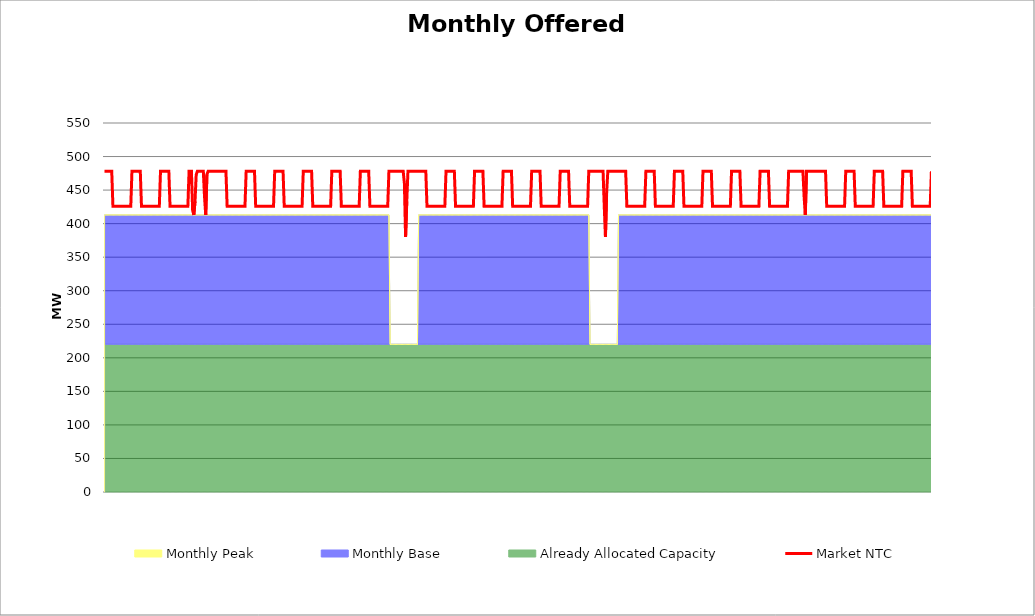
| Category | Market NTC |
|---|---|
| 0 | 478 |
| 1 | 478 |
| 2 | 478 |
| 3 | 478 |
| 4 | 478 |
| 5 | 478 |
| 6 | 478 |
| 7 | 426 |
| 8 | 426 |
| 9 | 426 |
| 10 | 426 |
| 11 | 426 |
| 12 | 426 |
| 13 | 426 |
| 14 | 426 |
| 15 | 426 |
| 16 | 426 |
| 17 | 426 |
| 18 | 426 |
| 19 | 426 |
| 20 | 426 |
| 21 | 426 |
| 22 | 426 |
| 23 | 478 |
| 24 | 478 |
| 25 | 478 |
| 26 | 478 |
| 27 | 478 |
| 28 | 478 |
| 29 | 478 |
| 30 | 478 |
| 31 | 426 |
| 32 | 426 |
| 33 | 426 |
| 34 | 426 |
| 35 | 426 |
| 36 | 426 |
| 37 | 426 |
| 38 | 426 |
| 39 | 426 |
| 40 | 426 |
| 41 | 426 |
| 42 | 426 |
| 43 | 426 |
| 44 | 426 |
| 45 | 426 |
| 46 | 426 |
| 47 | 478 |
| 48 | 478 |
| 49 | 478 |
| 50 | 478 |
| 51 | 478 |
| 52 | 478 |
| 53 | 478 |
| 54 | 478 |
| 55 | 426 |
| 56 | 426 |
| 57 | 426 |
| 58 | 426 |
| 59 | 426 |
| 60 | 426 |
| 61 | 426 |
| 62 | 426 |
| 63 | 426 |
| 64 | 426 |
| 65 | 426 |
| 66 | 426 |
| 67 | 426 |
| 68 | 426 |
| 69 | 426 |
| 70 | 426 |
| 71 | 478 |
| 72 | 478 |
| 73 | 478 |
| 74 | 420 |
| 75 | 413 |
| 76 | 433 |
| 77 | 473 |
| 78 | 478 |
| 79 | 478 |
| 80 | 478 |
| 81 | 478 |
| 82 | 478 |
| 83 | 478 |
| 84 | 440 |
| 85 | 413 |
| 86 | 473 |
| 87 | 478 |
| 88 | 478 |
| 89 | 478 |
| 90 | 478 |
| 91 | 478 |
| 92 | 478 |
| 93 | 478 |
| 94 | 478 |
| 95 | 478 |
| 96 | 478 |
| 97 | 478 |
| 98 | 478 |
| 99 | 478 |
| 100 | 478 |
| 101 | 478 |
| 102 | 478 |
| 103 | 426 |
| 104 | 426 |
| 105 | 426 |
| 106 | 426 |
| 107 | 426 |
| 108 | 426 |
| 109 | 426 |
| 110 | 426 |
| 111 | 426 |
| 112 | 426 |
| 113 | 426 |
| 114 | 426 |
| 115 | 426 |
| 116 | 426 |
| 117 | 426 |
| 118 | 426 |
| 119 | 478 |
| 120 | 478 |
| 121 | 478 |
| 122 | 478 |
| 123 | 478 |
| 124 | 478 |
| 125 | 478 |
| 126 | 478 |
| 127 | 426 |
| 128 | 426 |
| 129 | 426 |
| 130 | 426 |
| 131 | 426 |
| 132 | 426 |
| 133 | 426 |
| 134 | 426 |
| 135 | 426 |
| 136 | 426 |
| 137 | 426 |
| 138 | 426 |
| 139 | 426 |
| 140 | 426 |
| 141 | 426 |
| 142 | 426 |
| 143 | 478 |
| 144 | 478 |
| 145 | 478 |
| 146 | 478 |
| 147 | 478 |
| 148 | 478 |
| 149 | 478 |
| 150 | 478 |
| 151 | 426 |
| 152 | 426 |
| 153 | 426 |
| 154 | 426 |
| 155 | 426 |
| 156 | 426 |
| 157 | 426 |
| 158 | 426 |
| 159 | 426 |
| 160 | 426 |
| 161 | 426 |
| 162 | 426 |
| 163 | 426 |
| 164 | 426 |
| 165 | 426 |
| 166 | 426 |
| 167 | 478 |
| 168 | 478 |
| 169 | 478 |
| 170 | 478 |
| 171 | 478 |
| 172 | 478 |
| 173 | 478 |
| 174 | 478 |
| 175 | 426 |
| 176 | 426 |
| 177 | 426 |
| 178 | 426 |
| 179 | 426 |
| 180 | 426 |
| 181 | 426 |
| 182 | 426 |
| 183 | 426 |
| 184 | 426 |
| 185 | 426 |
| 186 | 426 |
| 187 | 426 |
| 188 | 426 |
| 189 | 426 |
| 190 | 426 |
| 191 | 478 |
| 192 | 478 |
| 193 | 478 |
| 194 | 478 |
| 195 | 478 |
| 196 | 478 |
| 197 | 478 |
| 198 | 478 |
| 199 | 426 |
| 200 | 426 |
| 201 | 426 |
| 202 | 426 |
| 203 | 426 |
| 204 | 426 |
| 205 | 426 |
| 206 | 426 |
| 207 | 426 |
| 208 | 426 |
| 209 | 426 |
| 210 | 426 |
| 211 | 426 |
| 212 | 426 |
| 213 | 426 |
| 214 | 426 |
| 215 | 478 |
| 216 | 478 |
| 217 | 478 |
| 218 | 478 |
| 219 | 478 |
| 220 | 478 |
| 221 | 478 |
| 222 | 478 |
| 223 | 426 |
| 224 | 426 |
| 225 | 426 |
| 226 | 426 |
| 227 | 426 |
| 228 | 426 |
| 229 | 426 |
| 230 | 426 |
| 231 | 426 |
| 232 | 426 |
| 233 | 426 |
| 234 | 426 |
| 235 | 426 |
| 236 | 426 |
| 237 | 426 |
| 238 | 426 |
| 239 | 478 |
| 240 | 478 |
| 241 | 478 |
| 242 | 478 |
| 243 | 478 |
| 244 | 478 |
| 245 | 478 |
| 246 | 478 |
| 247 | 478 |
| 248 | 478 |
| 249 | 478 |
| 250 | 478 |
| 251 | 478 |
| 252 | 460 |
| 253 | 380 |
| 254 | 433 |
| 255 | 478 |
| 256 | 478 |
| 257 | 478 |
| 258 | 478 |
| 259 | 478 |
| 260 | 478 |
| 261 | 478 |
| 262 | 478 |
| 263 | 478 |
| 264 | 478 |
| 265 | 478 |
| 266 | 478 |
| 267 | 478 |
| 268 | 478 |
| 269 | 478 |
| 270 | 478 |
| 271 | 426 |
| 272 | 426 |
| 273 | 426 |
| 274 | 426 |
| 275 | 426 |
| 276 | 426 |
| 277 | 426 |
| 278 | 426 |
| 279 | 426 |
| 280 | 426 |
| 281 | 426 |
| 282 | 426 |
| 283 | 426 |
| 284 | 426 |
| 285 | 426 |
| 286 | 426 |
| 287 | 478 |
| 288 | 478 |
| 289 | 478 |
| 290 | 478 |
| 291 | 478 |
| 292 | 478 |
| 293 | 478 |
| 294 | 478 |
| 295 | 426 |
| 296 | 426 |
| 297 | 426 |
| 298 | 426 |
| 299 | 426 |
| 300 | 426 |
| 301 | 426 |
| 302 | 426 |
| 303 | 426 |
| 304 | 426 |
| 305 | 426 |
| 306 | 426 |
| 307 | 426 |
| 308 | 426 |
| 309 | 426 |
| 310 | 426 |
| 311 | 478 |
| 312 | 478 |
| 313 | 478 |
| 314 | 478 |
| 315 | 478 |
| 316 | 478 |
| 317 | 478 |
| 318 | 478 |
| 319 | 426 |
| 320 | 426 |
| 321 | 426 |
| 322 | 426 |
| 323 | 426 |
| 324 | 426 |
| 325 | 426 |
| 326 | 426 |
| 327 | 426 |
| 328 | 426 |
| 329 | 426 |
| 330 | 426 |
| 331 | 426 |
| 332 | 426 |
| 333 | 426 |
| 334 | 426 |
| 335 | 478 |
| 336 | 478 |
| 337 | 478 |
| 338 | 478 |
| 339 | 478 |
| 340 | 478 |
| 341 | 478 |
| 342 | 478 |
| 343 | 426 |
| 344 | 426 |
| 345 | 426 |
| 346 | 426 |
| 347 | 426 |
| 348 | 426 |
| 349 | 426 |
| 350 | 426 |
| 351 | 426 |
| 352 | 426 |
| 353 | 426 |
| 354 | 426 |
| 355 | 426 |
| 356 | 426 |
| 357 | 426 |
| 358 | 426 |
| 359 | 478 |
| 360 | 478 |
| 361 | 478 |
| 362 | 478 |
| 363 | 478 |
| 364 | 478 |
| 365 | 478 |
| 366 | 478 |
| 367 | 426 |
| 368 | 426 |
| 369 | 426 |
| 370 | 426 |
| 371 | 426 |
| 372 | 426 |
| 373 | 426 |
| 374 | 426 |
| 375 | 426 |
| 376 | 426 |
| 377 | 426 |
| 378 | 426 |
| 379 | 426 |
| 380 | 426 |
| 381 | 426 |
| 382 | 426 |
| 383 | 478 |
| 384 | 478 |
| 385 | 478 |
| 386 | 478 |
| 387 | 478 |
| 388 | 478 |
| 389 | 478 |
| 390 | 478 |
| 391 | 426 |
| 392 | 426 |
| 393 | 426 |
| 394 | 426 |
| 395 | 426 |
| 396 | 426 |
| 397 | 426 |
| 398 | 426 |
| 399 | 426 |
| 400 | 426 |
| 401 | 426 |
| 402 | 426 |
| 403 | 426 |
| 404 | 426 |
| 405 | 426 |
| 406 | 426 |
| 407 | 478 |
| 408 | 478 |
| 409 | 478 |
| 410 | 478 |
| 411 | 478 |
| 412 | 478 |
| 413 | 478 |
| 414 | 478 |
| 415 | 478 |
| 416 | 478 |
| 417 | 478 |
| 418 | 478 |
| 419 | 478 |
| 420 | 426 |
| 421 | 380 |
| 422 | 446 |
| 423 | 478 |
| 424 | 478 |
| 425 | 478 |
| 426 | 478 |
| 427 | 478 |
| 428 | 478 |
| 429 | 478 |
| 430 | 478 |
| 431 | 478 |
| 432 | 478 |
| 433 | 478 |
| 434 | 478 |
| 435 | 478 |
| 436 | 478 |
| 437 | 478 |
| 438 | 478 |
| 439 | 426 |
| 440 | 426 |
| 441 | 426 |
| 442 | 426 |
| 443 | 426 |
| 444 | 426 |
| 445 | 426 |
| 446 | 426 |
| 447 | 426 |
| 448 | 426 |
| 449 | 426 |
| 450 | 426 |
| 451 | 426 |
| 452 | 426 |
| 453 | 426 |
| 454 | 426 |
| 455 | 478 |
| 456 | 478 |
| 457 | 478 |
| 458 | 478 |
| 459 | 478 |
| 460 | 478 |
| 461 | 478 |
| 462 | 478 |
| 463 | 426 |
| 464 | 426 |
| 465 | 426 |
| 466 | 426 |
| 467 | 426 |
| 468 | 426 |
| 469 | 426 |
| 470 | 426 |
| 471 | 426 |
| 472 | 426 |
| 473 | 426 |
| 474 | 426 |
| 475 | 426 |
| 476 | 426 |
| 477 | 426 |
| 478 | 426 |
| 479 | 478 |
| 480 | 478 |
| 481 | 478 |
| 482 | 478 |
| 483 | 478 |
| 484 | 478 |
| 485 | 478 |
| 486 | 478 |
| 487 | 426 |
| 488 | 426 |
| 489 | 426 |
| 490 | 426 |
| 491 | 426 |
| 492 | 426 |
| 493 | 426 |
| 494 | 426 |
| 495 | 426 |
| 496 | 426 |
| 497 | 426 |
| 498 | 426 |
| 499 | 426 |
| 500 | 426 |
| 501 | 426 |
| 502 | 426 |
| 503 | 478 |
| 504 | 478 |
| 505 | 478 |
| 506 | 478 |
| 507 | 478 |
| 508 | 478 |
| 509 | 478 |
| 510 | 478 |
| 511 | 426 |
| 512 | 426 |
| 513 | 426 |
| 514 | 426 |
| 515 | 426 |
| 516 | 426 |
| 517 | 426 |
| 518 | 426 |
| 519 | 426 |
| 520 | 426 |
| 521 | 426 |
| 522 | 426 |
| 523 | 426 |
| 524 | 426 |
| 525 | 426 |
| 526 | 426 |
| 527 | 478 |
| 528 | 478 |
| 529 | 478 |
| 530 | 478 |
| 531 | 478 |
| 532 | 478 |
| 533 | 478 |
| 534 | 478 |
| 535 | 426 |
| 536 | 426 |
| 537 | 426 |
| 538 | 426 |
| 539 | 426 |
| 540 | 426 |
| 541 | 426 |
| 542 | 426 |
| 543 | 426 |
| 544 | 426 |
| 545 | 426 |
| 546 | 426 |
| 547 | 426 |
| 548 | 426 |
| 549 | 426 |
| 550 | 426 |
| 551 | 478 |
| 552 | 478 |
| 553 | 478 |
| 554 | 478 |
| 555 | 478 |
| 556 | 478 |
| 557 | 478 |
| 558 | 478 |
| 559 | 426 |
| 560 | 426 |
| 561 | 426 |
| 562 | 426 |
| 563 | 426 |
| 564 | 426 |
| 565 | 426 |
| 566 | 426 |
| 567 | 426 |
| 568 | 426 |
| 569 | 426 |
| 570 | 426 |
| 571 | 426 |
| 572 | 426 |
| 573 | 426 |
| 574 | 426 |
| 575 | 478 |
| 576 | 478 |
| 577 | 478 |
| 578 | 478 |
| 579 | 478 |
| 580 | 478 |
| 581 | 478 |
| 582 | 478 |
| 583 | 478 |
| 584 | 478 |
| 585 | 478 |
| 586 | 478 |
| 587 | 478 |
| 588 | 440 |
| 589 | 413 |
| 590 | 478 |
| 591 | 478 |
| 592 | 478 |
| 593 | 478 |
| 594 | 478 |
| 595 | 478 |
| 596 | 478 |
| 597 | 478 |
| 598 | 478 |
| 599 | 478 |
| 600 | 478 |
| 601 | 478 |
| 602 | 478 |
| 603 | 478 |
| 604 | 478 |
| 605 | 478 |
| 606 | 478 |
| 607 | 426 |
| 608 | 426 |
| 609 | 426 |
| 610 | 426 |
| 611 | 426 |
| 612 | 426 |
| 613 | 426 |
| 614 | 426 |
| 615 | 426 |
| 616 | 426 |
| 617 | 426 |
| 618 | 426 |
| 619 | 426 |
| 620 | 426 |
| 621 | 426 |
| 622 | 426 |
| 623 | 478 |
| 624 | 478 |
| 625 | 478 |
| 626 | 478 |
| 627 | 478 |
| 628 | 478 |
| 629 | 478 |
| 630 | 478 |
| 631 | 426 |
| 632 | 426 |
| 633 | 426 |
| 634 | 426 |
| 635 | 426 |
| 636 | 426 |
| 637 | 426 |
| 638 | 426 |
| 639 | 426 |
| 640 | 426 |
| 641 | 426 |
| 642 | 426 |
| 643 | 426 |
| 644 | 426 |
| 645 | 426 |
| 646 | 426 |
| 647 | 478 |
| 648 | 478 |
| 649 | 478 |
| 650 | 478 |
| 651 | 478 |
| 652 | 478 |
| 653 | 478 |
| 654 | 478 |
| 655 | 426 |
| 656 | 426 |
| 657 | 426 |
| 658 | 426 |
| 659 | 426 |
| 660 | 426 |
| 661 | 426 |
| 662 | 426 |
| 663 | 426 |
| 664 | 426 |
| 665 | 426 |
| 666 | 426 |
| 667 | 426 |
| 668 | 426 |
| 669 | 426 |
| 670 | 426 |
| 671 | 478 |
| 672 | 478 |
| 673 | 478 |
| 674 | 478 |
| 675 | 478 |
| 676 | 478 |
| 677 | 478 |
| 678 | 478 |
| 679 | 426 |
| 680 | 426 |
| 681 | 426 |
| 682 | 426 |
| 683 | 426 |
| 684 | 426 |
| 685 | 426 |
| 686 | 426 |
| 687 | 426 |
| 688 | 426 |
| 689 | 426 |
| 690 | 426 |
| 691 | 426 |
| 692 | 426 |
| 693 | 426 |
| 694 | 426 |
| 695 | 478 |